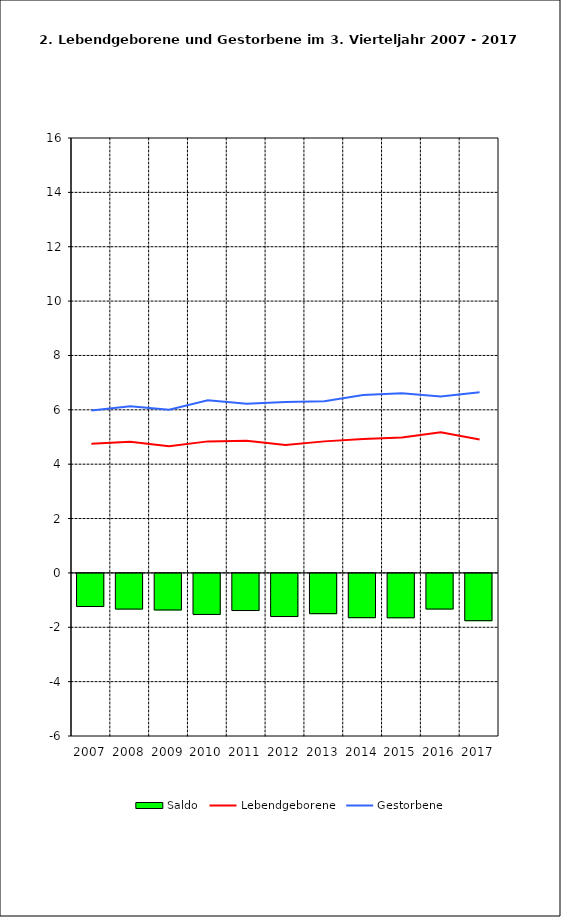
| Category | Saldo |
|---|---|
| 2005.0 | -1.217 |
| 2006.0 | -1.312 |
| 2007.0 | -1.345 |
| 2008.0 | -1.509 |
| 2009.0 | -1.366 |
| 2010.0 | -1.587 |
| 2011.0 | -1.48 |
| 2012.0 | -1.627 |
| 2013.0 | -1.632 |
| 2014.0 | -1.311 |
| 2015.0 | -1.739 |